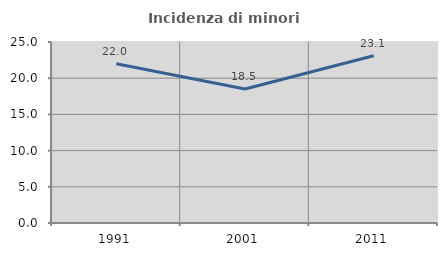
| Category | Incidenza di minori stranieri |
|---|---|
| 1991.0 | 22 |
| 2001.0 | 18.519 |
| 2011.0 | 23.102 |